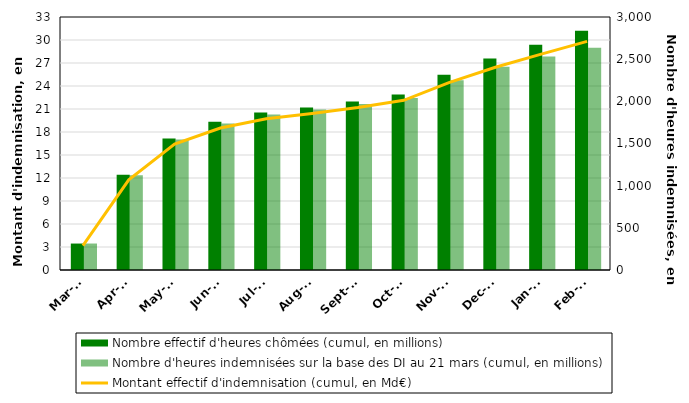
| Category | Nombre effectif d'heures chômées (cumul, en millions) | Nombre d'heures indemnisées sur la base des DI au 21 mars (cumul, en millions) |
|---|---|---|
| 0 | 313.671 | 314 |
| 1900-01-01 | 1130.752 | 1125 |
| 1900-01-02 | 1560.381 | 1548 |
| 1900-01-03 | 1756.963 | 1737 |
| 1900-01-04 | 1866.381 | 1844 |
| 1900-01-05 | 1927.645 | 1902 |
| 1900-01-06 | 1997.1 | 1969 |
| 1900-01-07 | 2080.857 | 2039 |
| 1900-01-08 | 2315.914 | 2251 |
| 1900-01-09 | 2509.294 | 2409 |
| 1900-01-10 | 2671.538 | 2533 |
| 1900-01-11 | 2835.937 | 2635 |